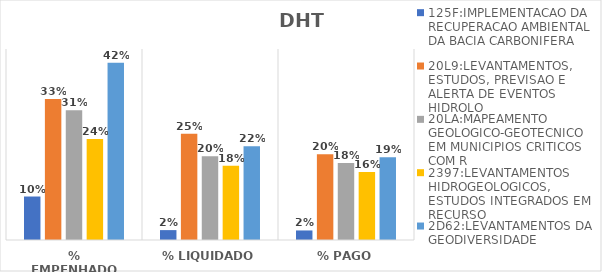
| Category | 125F:IMPLEMENTACAO DA RECUPERACAO AMBIENTAL DA BACIA CARBONIFERA | 20L9:LEVANTAMENTOS, ESTUDOS, PREVISAO E ALERTA DE EVENTOS HIDROLO | 20LA:MAPEAMENTO GEOLOGICO-GEOTECNICO EM MUNICIPIOS CRITICOS COM R | 2397:LEVANTAMENTOS HIDROGEOLOGICOS, ESTUDOS INTEGRADOS EM RECURSO | 2D62:LEVANTAMENTOS DA GEODIVERSIDADE |
|---|---|---|---|---|---|
| % EMPENHADO | 0.102 | 0.332 | 0.305 | 0.238 | 0.418 |
| % LIQUIDADO | 0.023 | 0.25 | 0.197 | 0.175 | 0.221 |
| % PAGO | 0.022 | 0.202 | 0.182 | 0.16 | 0.195 |